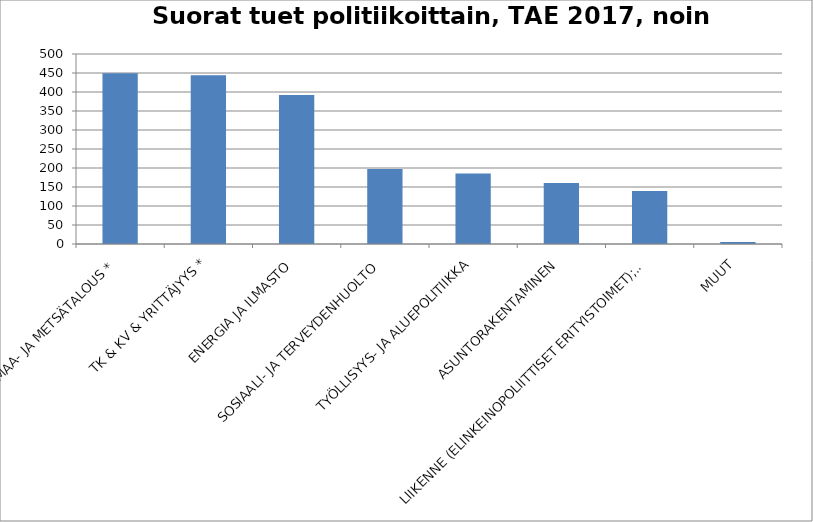
| Category | M€ |
|---|---|
| MAA- JA METSÄTALOUS * | 449.5 |
| TK & KV & YRITTÄJYYS * | 443.9 |
| ENERGIA JA ILMASTO | 392.1 |
| SOSIAALI- JA TERVEYDENHUOLTO | 197.5 |
| TYÖLLISYYS- JA ALUEPOLITIIKKA | 185.4 |
| ASUNTORAKENTAMINEN | 160.4 |
| LIIKENNE (ELINKEINOPOLIITTISET ERITYISTOIMET); VIESTINTÄ | 139.46 |
| MUUT | 5.5 |